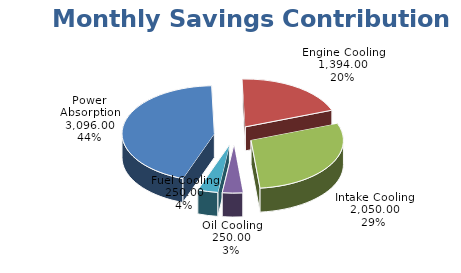
| Category | Power Absorption Engine Cooling Intake Cooling Oil Cooling Fuel Cooling |
|---|---|
| Power Absorption | 3096 |
| Engine Cooling | 1394 |
| Intake Cooling | 2050 |
| Oil Cooling | 250 |
| Fuel Cooling | 250 |